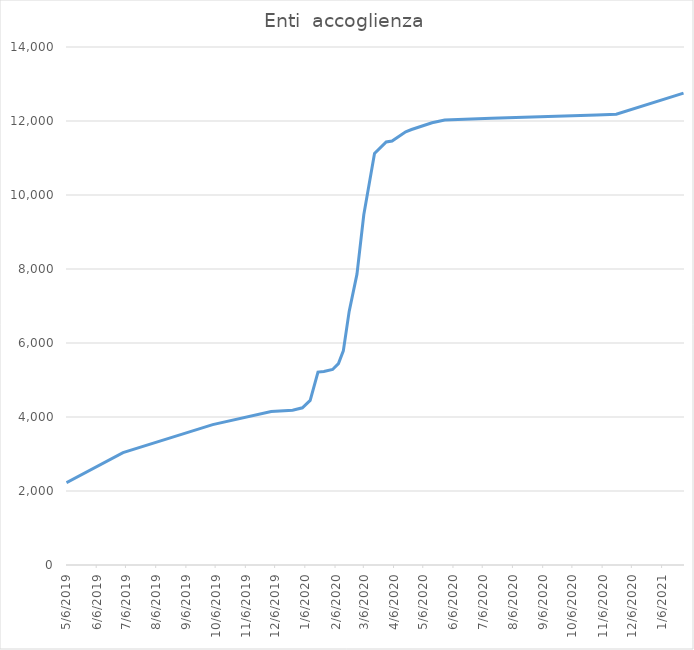
| Category | Enti  accoglienza |
|---|---|
| 5/6/19 | 2223 |
| 7/3/19 | 3038 |
| 10/3/19 | 3793 |
| 12/2/19 | 4149 |
| 12/24/19 | 4181 |
| 1/3/20 | 4249 |
| 1/11/20 | 4450 |
| 1/19/20 | 5214 |
| 1/25/20 | 5229 |
| 2/3/20 | 5285 |
| 2/9/20 | 5443 |
| 2/14/20 | 5787 |
| 2/20/20 | 6854 |
| 2/28/20 | 7861 |
| 3/6/20 | 9465 |
| 3/17/20 | 11122 |
| 3/29/20 | 11433 |
| 4/4/20 | 11460 |
| 4/18/20 | 11710 |
| 4/24/20 | 11770 |
| 5/15/20 | 11953 |
| 5/28/20 | 12025 |
| 7/15/20 | 12072 |
| 10/31/20 | 12161 |
| 11/20/20 | 12184 |
| 1/28/21 | 12752 |